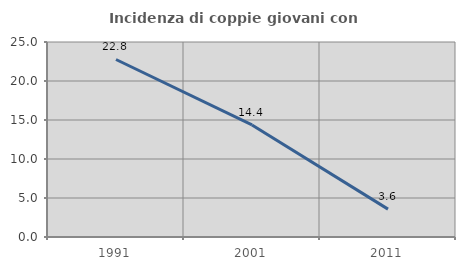
| Category | Incidenza di coppie giovani con figli |
|---|---|
| 1991.0 | 22.759 |
| 2001.0 | 14.371 |
| 2011.0 | 3.571 |